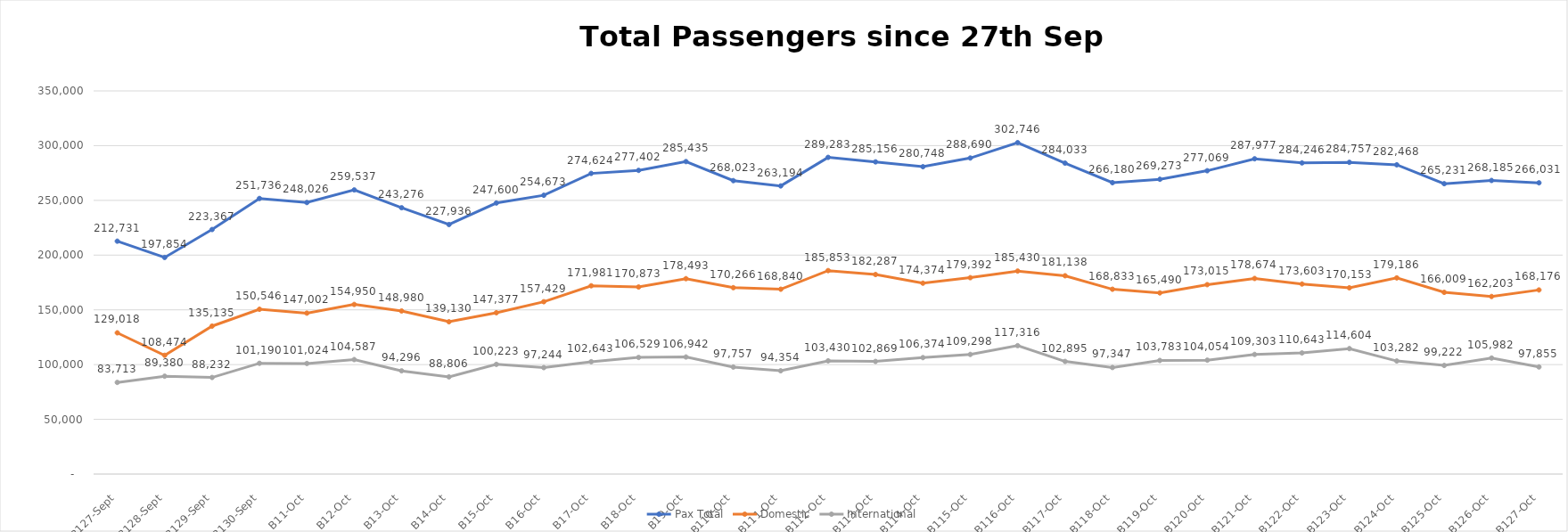
| Category | Pax Total |  Domestic  |  International  |
|---|---|---|---|
| 2022-09-27 | 212731 | 129018 | 83713 |
| 2022-09-28 | 197854 | 108474 | 89380 |
| 2022-09-29 | 223367 | 135135 | 88232 |
| 2022-09-30 | 251736 | 150546 | 101190 |
| 2022-10-01 | 248026 | 147002 | 101024 |
| 2022-10-02 | 259537 | 154950 | 104587 |
| 2022-10-03 | 243276 | 148980 | 94296 |
| 2022-10-04 | 227936 | 139130 | 88806 |
| 2022-10-05 | 247600 | 147377 | 100223 |
| 2022-10-06 | 254673 | 157429 | 97244 |
| 2022-10-07 | 274624 | 171981 | 102643 |
| 2022-10-08 | 277402 | 170873 | 106529 |
| 2022-10-09 | 285435 | 178493 | 106942 |
| 2022-10-10 | 268023 | 170266 | 97757 |
| 2022-10-11 | 263194 | 168840 | 94354 |
| 2022-10-12 | 289283 | 185853 | 103430 |
| 2022-10-13 | 285156 | 182287 | 102869 |
| 2022-10-14 | 280748 | 174374 | 106374 |
| 2022-10-15 | 288690 | 179392 | 109298 |
| 2022-10-16 | 302746 | 185430 | 117316 |
| 2022-10-17 | 284033 | 181138 | 102895 |
| 2022-10-18 | 266180 | 168833 | 97347 |
| 2022-10-19 | 269273 | 165490 | 103783 |
| 2022-10-20 | 277069 | 173015 | 104054 |
| 2022-10-21 | 287977 | 178674 | 109303 |
| 2022-10-22 | 284246 | 173603 | 110643 |
| 2022-10-23 | 284757 | 170153 | 114604 |
| 2022-10-24 | 282468 | 179186 | 103282 |
| 2022-10-25 | 265231 | 166009 | 99222 |
| 2022-10-26 | 268185 | 162203 | 105982 |
| 2022-10-27 | 266031 | 168176 | 97855 |